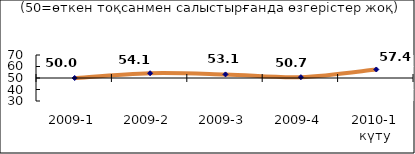
| Category | Диф.индекс ↓ |
|---|---|
| 2009-1 | 49.995 |
| 2009-2 | 54.14 |
| 2009-3 | 53.125 |
| 2009-4 | 50.73 |
| 2010-1 күту | 57.405 |